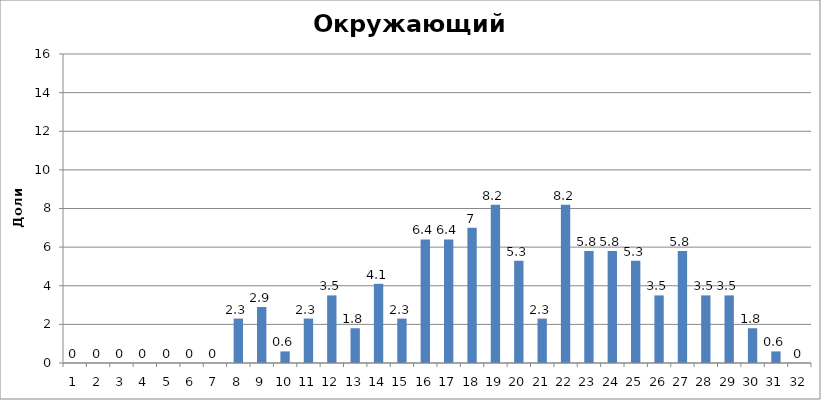
| Category | Series 0 |
|---|---|
| 0 | 0 |
| 1 | 0 |
| 2 | 0 |
| 3 | 0 |
| 4 | 0 |
| 5 | 0 |
| 6 | 0 |
| 7 | 2.3 |
| 8 | 2.9 |
| 9 | 0.6 |
| 10 | 2.3 |
| 11 | 3.5 |
| 12 | 1.8 |
| 13 | 4.1 |
| 14 | 2.3 |
| 15 | 6.4 |
| 16 | 6.4 |
| 17 | 7 |
| 18 | 8.2 |
| 19 | 5.3 |
| 20 | 2.3 |
| 21 | 8.2 |
| 22 | 5.8 |
| 23 | 5.8 |
| 24 | 5.3 |
| 25 | 3.5 |
| 26 | 5.8 |
| 27 | 3.5 |
| 28 | 3.5 |
| 29 | 1.8 |
| 30 | 0.6 |
| 31 | 0 |